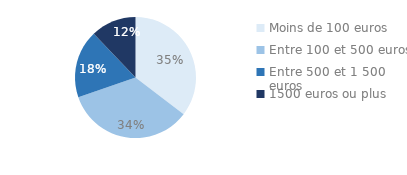
| Category | Series 0 |
|---|---|
| Moins de 100 euros | 0.35 |
| Entre 100 et 500 euros | 0.34 |
| Entre 500 et 1 500 euros | 0.18 |
| 1500 euros ou plus | 0.12 |